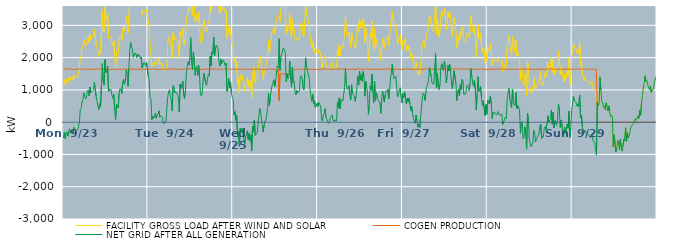
| Category | FACILITY GROSS LOAD AFTER WIND AND SOLAR | COGEN PRODUCTION | NET GRID AFTER ALL GENERATION |
|---|---|---|---|
|  Mon  9/23 | 1142 | 1635 | -493 |
|  Mon  9/23 | 1322 | 1630 | -308 |
|  Mon  9/23 | 1150 | 1656 | -506 |
|  Mon  9/23 | 1298 | 1635 | -337 |
|  Mon  9/23 | 1342 | 1638 | -296 |
|  Mon  9/23 | 1209 | 1644 | -435 |
|  Mon  9/23 | 1355 | 1656 | -301 |
|  Mon  9/23 | 1439 | 1647 | -208 |
|  Mon  9/23 | 1303 | 1643 | -340 |
|  Mon  9/23 | 1363 | 1641 | -278 |
|  Mon  9/23 | 1401 | 1644 | -243 |
|  Mon  9/23 | 1305 | 1645 | -340 |
|  Mon  9/23 | 1466 | 1624 | -158 |
|  Mon  9/23 | 1443 | 1645 | -202 |
|  Mon  9/23 | 1357 | 1649 | -292 |
|  Mon  9/23 | 1372 | 1648 | -276 |
|  Mon  9/23 | 1391 | 1645 | -254 |
|  Mon  9/23 | 1486 | 1633 | -147 |
|  Mon  9/23 | 1642 | 1653 | -11 |
|  Mon  9/23 | 2017 | 1637 | 380 |
|  Mon  9/23 | 2071 | 1639 | 432 |
|  Mon  9/23 | 2251 | 1643 | 608 |
|  Mon  9/23 | 2341 | 1645 | 696 |
|  Mon  9/23 | 2560 | 1650 | 910 |
|  Mon  9/23 | 2475 | 1656 | 819 |
|  Mon  9/23 | 2363 | 1646 | 717 |
|  Mon  9/23 | 2394 | 1633 | 761 |
|  Mon  9/23 | 2589 | 1630 | 959 |
|  Mon  9/23 | 2641 | 1646 | 995 |
|  Mon  9/23 | 2462 | 1648 | 814 |
|  Mon  9/23 | 2724 | 1638 | 1086 |
|  Mon  9/23 | 2541 | 1635 | 906 |
|  Mon  9/23 | 2583 | 1641 | 942 |
|  Mon  9/23 | 2618 | 1645 | 973 |
|  Mon  9/23 | 2645 | 1633 | 1012 |
|  Mon  9/23 | 2870 | 1634 | 1236 |
|  Mon  9/23 | 2862 | 1643 | 1219 |
|  Mon  9/23 | 2427 | 1629 | 798 |
|  Mon  9/23 | 2298 | 1653 | 645 |
|  Mon  9/23 | 2149 | 1647 | 502 |
|  Mon  9/23 | 2040 | 1643 | 397 |
|  Mon  9/23 | 2221 | 1643 | 578 |
|  Mon  9/23 | 2132 | 1653 | 479 |
|  Mon  9/23 | 2774 | 1649 | 1125 |
|  Mon  9/23 | 3462 | 1646 | 1816 |
|  Mon  9/23 | 2880 | 1625 | 1255 |
|  Mon  9/23 | 2790 | 1636 | 1154 |
|  Mon  9/23 | 3579 | 1641 | 1938 |
|  Mon  9/23 | 3178 | 1643 | 1535 |
|  Mon  9/23 | 3210 | 1627 | 1583 |
|  Mon  9/23 | 3377 | 1644 | 1733 |
|  Mon  9/23 | 2595 | 1648 | 947 |
|  Mon  9/23 | 2645 | 1634 | 1011 |
|  Mon  9/23 | 2635 | 1637 | 998 |
|  Mon  9/23 | 2640 | 1639 | 1001 |
|  Mon  9/23 | 2461 | 1646 | 815 |
|  Mon  9/23 | 2374 | 1633 | 741 |
|  Mon  9/23 | 2522 | 1661 | 861 |
|  Mon  9/23 | 2035 | 1647 | 388 |
|  Mon  9/23 | 1720 | 1638 | 82 |
|  Mon  9/23 | 2190 | 1632 | 558 |
|  Mon  9/23 | 2198 | 1634 | 564 |
|  Mon  9/23 | 2094 | 1646 | 448 |
|  Mon  9/23 | 2564 | 1647 | 917 |
|  Mon  9/23 | 2676 | 1641 | 1035 |
|  Mon  9/23 | 2637 | 1643 | 994 |
|  Mon  9/23 | 2527 | 1638 | 889 |
|  Mon  9/23 | 2866 | 1634 | 1232 |
|  Mon  9/23 | 2975 | 1646 | 1329 |
|  Mon  9/23 | 2819 | 1641 | 1178 |
|  Mon  9/23 | 2895 | 1643 | 1252 |
|  Mon  9/23 | 3273 | 1652 | 1621 |
|  Mon  9/23 | 3163 | 1639 | 1524 |
|  Mon  9/23 | 2748 | 1636 | 1112 |
|  Mon  9/23 | 3281 | 1639 | 1642 |
|  Mon  9/23 | 3867 | 1647 | 2220 |
|  Mon  9/23 | 4110 | 1647 | 2463 |
|  Mon  9/23 | 3961 | 1630 | 2331 |
|  Mon  9/23 | 3904 | 1643 | 2261 |
|  Mon  9/23 | 3646 | 1637 | 2009 |
|  Mon  9/23 | 3714 | 1638 | 2076 |
|  Mon  9/23 | 3788 | 1643 | 2145 |
|  Mon  9/23 | 3753 | 1643 | 2110 |
|  Mon  9/23 | 3640 | 1635 | 2005 |
|  Mon  9/23 | 3760 | 1645 | 2115 |
|  Mon  9/23 | 3684 | 1640 | 2044 |
|  Mon  9/23 | 3724 | 1643 | 2081 |
|  Mon  9/23 | 3597 | 1639 | 1958 |
|  Mon  9/23 | 3654 | 1631 | 2023 |
|  Mon  9/23 | 3324 | 1645 | 1679 |
|  Mon  9/23 | 3396 | 1641 | 1755 |
|  Mon  9/23 | 3487 | 1643 | 1844 |
|  Mon  9/23 | 3498 | 1639 | 1859 |
|  Mon  9/23 | 3399 | 1639 | 1760 |
|  Mon  9/23 | 3491 | 1640 | 1851 |
|  Mon  9/23 | 3475 | 1647 | 1828 |
|  Tue  9/24 | 3061 | 1635 | 1426 |
|  Tue  9/24 | 2957 | 1650 | 1307 |
|  Tue  9/24 | 2404 | 1637 | 767 |
|  Tue  9/24 | 2375 | 1640 | 735 |
|  Tue  9/24 | 1716 | 1639 | 77 |
|  Tue  9/24 | 1828 | 1635 | 193 |
|  Tue  9/24 | 1773 | 1658 | 115 |
|  Tue  9/24 | 1841 | 1650 | 191 |
|  Tue  9/24 | 1920 | 1642 | 278 |
|  Tue  9/24 | 1774 | 1653 | 121 |
|  Tue  9/24 | 1787 | 1636 | 151 |
|  Tue  9/24 | 1899 | 1637 | 262 |
|  Tue  9/24 | 1986 | 1631 | 355 |
|  Tue  9/24 | 1782 | 1630 | 152 |
|  Tue  9/24 | 1849 | 1640 | 209 |
|  Tue  9/24 | 1877 | 1648 | 229 |
|  Tue  9/24 | 1793 | 1636 | 157 |
|  Tue  9/24 | 1606 | 1644 | -38 |
|  Tue  9/24 | 1594 | 1644 | -50 |
|  Tue  9/24 | 1621 | 1641 | -20 |
|  Tue  9/24 | 1688 | 1643 | 45 |
|  Tue  9/24 | 1657 | 1634 | 23 |
|  Tue  9/24 | 2448 | 1646 | 802 |
|  Tue  9/24 | 2585 | 1644 | 941 |
|  Tue  9/24 | 2648 | 1646 | 1002 |
|  Tue  9/24 | 2428 | 1647 | 781 |
|  Tue  9/24 | 2348 | 1639 | 709 |
|  Tue  9/24 | 1996 | 1647 | 349 |
|  Tue  9/24 | 2782 | 1650 | 1132 |
|  Tue  9/24 | 2739 | 1640 | 1099 |
|  Tue  9/24 | 2550 | 1644 | 906 |
|  Tue  9/24 | 2598 | 1640 | 958 |
|  Tue  9/24 | 2564 | 1646 | 918 |
|  Tue  9/24 | 2575 | 1647 | 928 |
|  Tue  9/24 | 2391 | 1628 | 763 |
|  Tue  9/24 | 1961 | 1642 | 319 |
|  Tue  9/24 | 2801 | 1634 | 1167 |
|  Tue  9/24 | 2679 | 1639 | 1040 |
|  Tue  9/24 | 2720 | 1651 | 1069 |
|  Tue  9/24 | 2916 | 1647 | 1269 |
|  Tue  9/24 | 2481 | 1635 | 846 |
|  Tue  9/24 | 2391 | 1658 | 733 |
|  Tue  9/24 | 2612 | 1648 | 964 |
|  Tue  9/24 | 3159 | 1639 | 1520 |
|  Tue  9/24 | 3326 | 1641 | 1685 |
|  Tue  9/24 | 3510 | 1642 | 1868 |
|  Tue  9/24 | 3425 | 1650 | 1775 |
|  Tue  9/24 | 3632 | 1639 | 1993 |
|  Tue  9/24 | 4264 | 1647 | 2617 |
|  Tue  9/24 | 3466 | 1649 | 1817 |
|  Tue  9/24 | 3284 | 1657 | 1627 |
|  Tue  9/24 | 3817 | 1641 | 2176 |
|  Tue  9/24 | 3558 | 1652 | 1906 |
|  Tue  9/24 | 3096 | 1642 | 1454 |
|  Tue  9/24 | 3353 | 1655 | 1698 |
|  Tue  9/24 | 3382 | 1647 | 1735 |
|  Tue  9/24 | 3086 | 1640 | 1446 |
|  Tue  9/24 | 3415 | 1656 | 1759 |
|  Tue  9/24 | 3072 | 1644 | 1428 |
|  Tue  9/24 | 2503 | 1648 | 855 |
|  Tue  9/24 | 2444 | 1630 | 814 |
|  Tue  9/24 | 2530 | 1639 | 891 |
|  Tue  9/24 | 2951 | 1642 | 1309 |
|  Tue  9/24 | 3150 | 1641 | 1509 |
|  Tue  9/24 | 3171 | 1642 | 1529 |
|  Tue  9/24 | 2840 | 1649 | 1191 |
|  Tue  9/24 | 2798 | 1653 | 1145 |
|  Tue  9/24 | 2977 | 1644 | 1333 |
|  Tue  9/24 | 3120 | 1628 | 1492 |
|  Tue  9/24 | 3068 | 1630 | 1438 |
|  Tue  9/24 | 3686 | 1644 | 2042 |
|  Tue  9/24 | 3403 | 1656 | 1747 |
|  Tue  9/24 | 3820 | 1644 | 2176 |
|  Tue  9/24 | 3748 | 1643 | 2105 |
|  Tue  9/24 | 4276 | 1645 | 2631 |
|  Tue  9/24 | 3694 | 1634 | 2060 |
|  Tue  9/24 | 3939 | 1648 | 2291 |
|  Tue  9/24 | 4036 | 1644 | 2392 |
|  Tue  9/24 | 4031 | 1648 | 2383 |
|  Tue  9/24 | 3888 | 1640 | 2248 |
|  Tue  9/24 | 3484 | 1643 | 1841 |
|  Tue  9/24 | 3368 | 1631 | 1737 |
|  Tue  9/24 | 3605 | 1645 | 1960 |
|  Tue  9/24 | 3458 | 1644 | 1814 |
|  Tue  9/24 | 3516 | 1635 | 1881 |
|  Tue  9/24 | 3582 | 1653 | 1929 |
|  Tue  9/24 | 3593 | 1646 | 1947 |
|  Tue  9/24 | 3415 | 1656 | 1759 |
|  Tue  9/24 | 3476 | 1645 | 1831 |
|  Tue  9/24 | 2598 | 1644 | 954 |
|  Tue  9/24 | 2726 | 1644 | 1082 |
|  Tue  9/24 | 3005 | 1652 | 1353 |
|  Tue  9/24 | 2703 | 1639 | 1064 |
|  Tue  9/24 | 2887 | 1638 | 1249 |
|  Tue  9/24 | 2557 | 1645 | 912 |
|  Tue  9/24 | 2400 | 1636 | 764 |
|  Wed  9/25 | 2342 | 1637 | 705 |
|  Wed  9/25 | 1876 | 1647 | 229 |
|  Wed  9/25 | 1970 | 1641 | 329 |
|  Wed  9/25 | 1701 | 1641 | 60 |
|  Wed  9/25 | 1868 | 1646 | 222 |
|  Wed  9/25 | 1180 | 1638 | -458 |
|  Wed  9/25 | 1368 | 1644 | -276 |
|  Wed  9/25 | 900 | 1647 | -747 |
|  Wed  9/25 | 1451 | 1645 | -194 |
|  Wed  9/25 | 1352 | 1632 | -280 |
|  Wed  9/25 | 1455 | 1646 | -191 |
|  Wed  9/25 | 1298 | 1640 | -342 |
|  Wed  9/25 | 1302 | 1646 | -344 |
|  Wed  9/25 | 945 | 1632 | -687 |
|  Wed  9/25 | 1185 | 1634 | -449 |
|  Wed  9/25 | 1270 | 1647 | -377 |
|  Wed  9/25 | 1379 | 1649 | -270 |
|  Wed  9/25 | 1097 | 1635 | -538 |
|  Wed  9/25 | 1299 | 1633 | -334 |
|  Wed  9/25 | 1070 | 1641 | -571 |
|  Wed  9/25 | 1249 | 1643 | -394 |
|  Wed  9/25 | 769 | 1648 | -879 |
|  Wed  9/25 | 1528 | 1658 | -130 |
|  Wed  9/25 | 1358 | 1648 | -290 |
|  Wed  9/25 | 1697 | 1631 | 66 |
|  Wed  9/25 | 1217 | 1630 | -413 |
|  Wed  9/25 | 1255 | 1646 | -391 |
|  Wed  9/25 | 1290 | 1641 | -351 |
|  Wed  9/25 | 1532 | 1646 | -114 |
|  Wed  9/25 | 1814 | 1639 | 175 |
|  Wed  9/25 | 2058 | 1639 | 419 |
|  Wed  9/25 | 1944 | 1638 | 306 |
|  Wed  9/25 | 1748 | 1639 | 109 |
|  Wed  9/25 | 1774 | 1656 | 118 |
|  Wed  9/25 | 1325 | 1630 | -305 |
|  Wed  9/25 | 1553 | 1647 | -94 |
|  Wed  9/25 | 1664 | 1631 | 33 |
|  Wed  9/25 | 1712 | 1642 | 70 |
|  Wed  9/25 | 1861 | 1636 | 225 |
|  Wed  9/25 | 2101 | 1647 | 454 |
|  Wed  9/25 | 2544 | 1649 | 895 |
|  Wed  9/25 | 2157 | 1638 | 519 |
|  Wed  9/25 | 2425 | 1644 | 781 |
|  Wed  9/25 | 2617 | 1646 | 971 |
|  Wed  9/25 | 2772 | 1635 | 1137 |
|  Wed  9/25 | 2846 | 1645 | 1201 |
|  Wed  9/25 | 2951 | 1635 | 1316 |
|  Wed  9/25 | 2731 | 1640 | 1091 |
|  Wed  9/25 | 2907 | 1638 | 1269 |
|  Wed  9/25 | 3199 | 1647 | 1552 |
|  Wed  9/25 | 3274 | 1546 | 1728 |
|  Wed  9/25 | 3324 | 1644 | 1680 |
|  Wed  9/25 | 3258 | 670 | 2588 |
|  Wed  9/25 | 3101 | 1494 | 1607 |
|  Wed  9/25 | 3502 | 1492 | 2010 |
|  Wed  9/25 | 3606 | 1501 | 2105 |
|  Wed  9/25 | 3729 | 1492 | 2237 |
|  Wed  9/25 | 3791 | 1494 | 2297 |
|  Wed  9/25 | 3740 | 1492 | 2248 |
|  Wed  9/25 | 3621 | 1492 | 2129 |
|  Wed  9/25 | 2750 | 1489 | 1261 |
|  Wed  9/25 | 2994 | 1490 | 1504 |
|  Wed  9/25 | 2840 | 1487 | 1353 |
|  Wed  9/25 | 2912 | 1494 | 1418 |
|  Wed  9/25 | 3391 | 1501 | 1890 |
|  Wed  9/25 | 2850 | 1490 | 1360 |
|  Wed  9/25 | 2576 | 1492 | 1084 |
|  Wed  9/25 | 3205 | 1494 | 1711 |
|  Wed  9/25 | 2853 | 1631 | 1222 |
|  Wed  9/25 | 2907 | 1642 | 1265 |
|  Wed  9/25 | 2580 | 1637 | 943 |
|  Wed  9/25 | 2502 | 1653 | 849 |
|  Wed  9/25 | 2616 | 1635 | 981 |
|  Wed  9/25 | 2551 | 1642 | 909 |
|  Wed  9/25 | 2568 | 1646 | 922 |
|  Wed  9/25 | 2614 | 1638 | 976 |
|  Wed  9/25 | 3044 | 1642 | 1402 |
|  Wed  9/25 | 3090 | 1649 | 1441 |
|  Wed  9/25 | 3036 | 1648 | 1388 |
|  Wed  9/25 | 2694 | 1642 | 1052 |
|  Wed  9/25 | 2639 | 1642 | 997 |
|  Wed  9/25 | 3137 | 1643 | 1494 |
|  Wed  9/25 | 3636 | 1638 | 1998 |
|  Wed  9/25 | 3351 | 1636 | 1715 |
|  Wed  9/25 | 3253 | 1647 | 1606 |
|  Wed  9/25 | 3224 | 1636 | 1588 |
|  Wed  9/25 | 3008 | 1652 | 1356 |
|  Wed  9/25 | 2666 | 1642 | 1024 |
|  Wed  9/25 | 2445 | 1629 | 816 |
|  Wed  9/25 | 2293 | 1644 | 649 |
|  Wed  9/25 | 2498 | 1637 | 861 |
|  Wed  9/25 | 2204 | 1629 | 575 |
|  Wed  9/25 | 2291 | 1631 | 660 |
|  Wed  9/25 | 2107 | 1650 | 457 |
|  Wed  9/25 | 2160 | 1635 | 525 |
|  Wed  9/25 | 2241 | 1647 | 594 |
|  Thu  9/26 | 2132 | 1643 | 489 |
|  Thu  9/26 | 2248 | 1641 | 607 |
|  Thu  9/26 | 2186 | 1635 | 551 |
|  Thu  9/26 | 2129 | 1643 | 486 |
|  Thu  9/26 | 1737 | 1643 | 94 |
|  Thu  9/26 | 1667 | 1633 | 34 |
|  Thu  9/26 | 1887 | 1658 | 229 |
|  Thu  9/26 | 1912 | 1645 | 267 |
|  Thu  9/26 | 2067 | 1650 | 417 |
|  Thu  9/26 | 1795 | 1644 | 151 |
|  Thu  9/26 | 1728 | 1645 | 83 |
|  Thu  9/26 | 1660 | 1645 | 15 |
|  Thu  9/26 | 1598 | 1640 | -42 |
|  Thu  9/26 | 1630 | 1635 | -5 |
|  Thu  9/26 | 1782 | 1641 | 141 |
|  Thu  9/26 | 1823 | 1646 | 177 |
|  Thu  9/26 | 1859 | 1636 | 223 |
|  Thu  9/26 | 1702 | 1636 | 66 |
|  Thu  9/26 | 1665 | 1650 | 15 |
|  Thu  9/26 | 1705 | 1634 | 71 |
|  Thu  9/26 | 1711 | 1643 | 68 |
|  Thu  9/26 | 1677 | 1642 | 35 |
|  Thu  9/26 | 2257 | 1644 | 613 |
|  Thu  9/26 | 2073 | 1635 | 438 |
|  Thu  9/26 | 2408 | 1651 | 757 |
|  Thu  9/26 | 2056 | 1646 | 410 |
|  Thu  9/26 | 2346 | 1646 | 700 |
|  Thu  9/26 | 2360 | 1637 | 723 |
|  Thu  9/26 | 2294 | 1640 | 654 |
|  Thu  9/26 | 2501 | 1653 | 848 |
|  Thu  9/26 | 2718 | 1651 | 1067 |
|  Thu  9/26 | 3304 | 1639 | 1665 |
|  Thu  9/26 | 2839 | 1640 | 1199 |
|  Thu  9/26 | 2655 | 1637 | 1018 |
|  Thu  9/26 | 2685 | 1634 | 1051 |
|  Thu  9/26 | 2778 | 1644 | 1134 |
|  Thu  9/26 | 2471 | 1636 | 835 |
|  Thu  9/26 | 2317 | 1634 | 683 |
|  Thu  9/26 | 2797 | 1638 | 1159 |
|  Thu  9/26 | 2545 | 1650 | 895 |
|  Thu  9/26 | 2495 | 1651 | 844 |
|  Thu  9/26 | 2463 | 1652 | 811 |
|  Thu  9/26 | 2285 | 1639 | 646 |
|  Thu  9/26 | 2421 | 1642 | 779 |
|  Thu  9/26 | 2705 | 1635 | 1070 |
|  Thu  9/26 | 3063 | 1640 | 1423 |
|  Thu  9/26 | 2815 | 1654 | 1161 |
|  Thu  9/26 | 3203 | 1628 | 1575 |
|  Thu  9/26 | 2943 | 1641 | 1302 |
|  Thu  9/26 | 3104 | 1634 | 1470 |
|  Thu  9/26 | 2923 | 1652 | 1271 |
|  Thu  9/26 | 3207 | 1640 | 1567 |
|  Thu  9/26 | 3076 | 1644 | 1432 |
|  Thu  9/26 | 2456 | 1652 | 804 |
|  Thu  9/26 | 2911 | 1646 | 1265 |
|  Thu  9/26 | 2725 | 1645 | 1080 |
|  Thu  9/26 | 2576 | 1640 | 936 |
|  Thu  9/26 | 1877 | 1636 | 241 |
|  Thu  9/26 | 2196 | 1648 | 548 |
|  Thu  9/26 | 2753 | 1638 | 1115 |
|  Thu  9/26 | 2640 | 1647 | 993 |
|  Thu  9/26 | 3127 | 1637 | 1490 |
|  Thu  9/26 | 2583 | 1639 | 944 |
|  Thu  9/26 | 2232 | 1640 | 592 |
|  Thu  9/26 | 2909 | 1635 | 1274 |
|  Thu  9/26 | 2318 | 1655 | 663 |
|  Thu  9/26 | 2557 | 1646 | 911 |
|  Thu  9/26 | 2403 | 1630 | 773 |
|  Thu  9/26 | 2316 | 1637 | 679 |
|  Thu  9/26 | 2328 | 1638 | 690 |
|  Thu  9/26 | 2242 | 1643 | 599 |
|  Thu  9/26 | 1917 | 1646 | 271 |
|  Thu  9/26 | 2363 | 1635 | 728 |
|  Thu  9/26 | 2599 | 1638 | 961 |
|  Thu  9/26 | 2599 | 1635 | 964 |
|  Thu  9/26 | 2261 | 1639 | 622 |
|  Thu  9/26 | 2502 | 1652 | 850 |
|  Thu  9/26 | 2618 | 1647 | 971 |
|  Thu  9/26 | 2580 | 1641 | 939 |
|  Thu  9/26 | 2674 | 1645 | 1029 |
|  Thu  9/26 | 2365 | 1647 | 718 |
|  Thu  9/26 | 2634 | 1652 | 982 |
|  Thu  9/26 | 2984 | 1636 | 1348 |
|  Thu  9/26 | 3184 | 1652 | 1532 |
|  Thu  9/26 | 3447 | 1644 | 1803 |
|  Thu  9/26 | 3126 | 1642 | 1484 |
|  Thu  9/26 | 2999 | 1651 | 1348 |
|  Thu  9/26 | 3001 | 1639 | 1362 |
|  Thu  9/26 | 3055 | 1633 | 1422 |
|  Thu  9/26 | 2711 | 1629 | 1082 |
|  Thu  9/26 | 2428 | 1638 | 790 |
|  Thu  9/26 | 2518 | 1641 | 877 |
|  Thu  9/26 | 2511 | 1642 | 869 |
|  Thu  9/26 | 2714 | 1647 | 1067 |
|  Thu  9/26 | 2415 | 1635 | 780 |
|  Thu  9/26 | 2236 | 1640 | 596 |
|  Fri  9/27 | 2524 | 1644 | 880 |
|  Fri  9/27 | 2396 | 1636 | 760 |
|  Fri  9/27 | 2579 | 1635 | 944 |
|  Fri  9/27 | 2592 | 1647 | 945 |
|  Fri  9/27 | 2209 | 1646 | 563 |
|  Fri  9/27 | 2371 | 1632 | 739 |
|  Fri  9/27 | 2271 | 1644 | 627 |
|  Fri  9/27 | 2379 | 1634 | 745 |
|  Fri  9/27 | 2203 | 1644 | 559 |
|  Fri  9/27 | 2000 | 1641 | 359 |
|  Fri  9/27 | 2129 | 1638 | 491 |
|  Fri  9/27 | 1904 | 1637 | 267 |
|  Fri  9/27 | 1749 | 1642 | 107 |
|  Fri  9/27 | 1734 | 1642 | 92 |
|  Fri  9/27 | 1605 | 1638 | -33 |
|  Fri  9/27 | 1858 | 1638 | 220 |
|  Fri  9/27 | 1695 | 1650 | 45 |
|  Fri  9/27 | 1487 | 1639 | -152 |
|  Fri  9/27 | 1574 | 1636 | -62 |
|  Fri  9/27 | 1471 | 1647 | -176 |
|  Fri  9/27 | 1772 | 1641 | 131 |
|  Fri  9/27 | 1785 | 1644 | 141 |
|  Fri  9/27 | 2380 | 1636 | 744 |
|  Fri  9/27 | 2552 | 1649 | 903 |
|  Fri  9/27 | 2498 | 1633 | 865 |
|  Fri  9/27 | 2316 | 1640 | 676 |
|  Fri  9/27 | 2596 | 1655 | 941 |
|  Fri  9/27 | 2746 | 1644 | 1102 |
|  Fri  9/27 | 2752 | 1641 | 1111 |
|  Fri  9/27 | 2930 | 1644 | 1286 |
|  Fri  9/27 | 3328 | 1635 | 1693 |
|  Fri  9/27 | 3308 | 1645 | 1663 |
|  Fri  9/27 | 3070 | 1648 | 1422 |
|  Fri  9/27 | 2855 | 1638 | 1217 |
|  Fri  9/27 | 2876 | 1643 | 1233 |
|  Fri  9/27 | 2806 | 1635 | 1171 |
|  Fri  9/27 | 2822 | 1650 | 1172 |
|  Fri  9/27 | 3770 | 1636 | 2134 |
|  Fri  9/27 | 2700 | 1644 | 1056 |
|  Fri  9/27 | 3170 | 1649 | 1521 |
|  Fri  9/27 | 2730 | 1635 | 1095 |
|  Fri  9/27 | 2652 | 1641 | 1011 |
|  Fri  9/27 | 2819 | 1638 | 1181 |
|  Fri  9/27 | 3341 | 1638 | 1703 |
|  Fri  9/27 | 3456 | 1645 | 1811 |
|  Fri  9/27 | 3281 | 1635 | 1646 |
|  Fri  9/27 | 3234 | 1631 | 1603 |
|  Fri  9/27 | 3529 | 1632 | 1897 |
|  Fri  9/27 | 3351 | 1661 | 1690 |
|  Fri  9/27 | 2855 | 1633 | 1222 |
|  Fri  9/27 | 3035 | 1643 | 1392 |
|  Fri  9/27 | 3405 | 1645 | 1760 |
|  Fri  9/27 | 3239 | 1647 | 1592 |
|  Fri  9/27 | 3416 | 1626 | 1790 |
|  Fri  9/27 | 3206 | 1652 | 1554 |
|  Fri  9/27 | 2855 | 1642 | 1213 |
|  Fri  9/27 | 2668 | 1640 | 1028 |
|  Fri  9/27 | 2668 | 1646 | 1022 |
|  Fri  9/27 | 3236 | 1648 | 1588 |
|  Fri  9/27 | 3249 | 1638 | 1611 |
|  Fri  9/27 | 2848 | 1642 | 1206 |
|  Fri  9/27 | 2313 | 1647 | 666 |
|  Fri  9/27 | 2583 | 1639 | 944 |
|  Fri  9/27 | 2679 | 1653 | 1026 |
|  Fri  9/27 | 2465 | 1649 | 816 |
|  Fri  9/27 | 2811 | 1649 | 1162 |
|  Fri  9/27 | 2658 | 1648 | 1010 |
|  Fri  9/27 | 2965 | 1640 | 1325 |
|  Fri  9/27 | 2933 | 1645 | 1288 |
|  Fri  9/27 | 2495 | 1643 | 852 |
|  Fri  9/27 | 2500 | 1647 | 853 |
|  Fri  9/27 | 2529 | 1650 | 879 |
|  Fri  9/27 | 2696 | 1647 | 1049 |
|  Fri  9/27 | 2794 | 1638 | 1156 |
|  Fri  9/27 | 2774 | 1647 | 1127 |
|  Fri  9/27 | 2634 | 1649 | 985 |
|  Fri  9/27 | 2854 | 1644 | 1210 |
|  Fri  9/27 | 3307 | 1646 | 1661 |
|  Fri  9/27 | 3048 | 1633 | 1415 |
|  Fri  9/27 | 2845 | 1644 | 1201 |
|  Fri  9/27 | 2765 | 1648 | 1117 |
|  Fri  9/27 | 2952 | 1649 | 1303 |
|  Fri  9/27 | 2638 | 1639 | 999 |
|  Fri  9/27 | 2024 | 1641 | 383 |
|  Fri  9/27 | 2493 | 1631 | 862 |
|  Fri  9/27 | 3040 | 1630 | 1410 |
|  Fri  9/27 | 2589 | 1637 | 952 |
|  Fri  9/27 | 2649 | 1644 | 1005 |
|  Fri  9/27 | 2756 | 1652 | 1104 |
|  Fri  9/27 | 2366 | 1641 | 725 |
|  Fri  9/27 | 2161 | 1650 | 511 |
|  Fri  9/27 | 2307 | 1643 | 664 |
|  Fri  9/27 | 2263 | 1628 | 635 |
|  Fri  9/27 | 1843 | 1641 | 202 |
|  Fri  9/27 | 2187 | 1638 | 549 |
|  Fri  9/27 | 1886 | 1640 | 246 |
|  Sat  9/28 | 2314 | 1629 | 685 |
|  Sat  9/28 | 2343 | 1649 | 694 |
|  Sat  9/28 | 2198 | 1639 | 559 |
|  Sat  9/28 | 2447 | 1640 | 807 |
|  Sat  9/28 | 2242 | 1640 | 602 |
|  Sat  9/28 | 1750 | 1638 | 112 |
|  Sat  9/28 | 1940 | 1638 | 302 |
|  Sat  9/28 | 1925 | 1642 | 283 |
|  Sat  9/28 | 1939 | 1640 | 299 |
|  Sat  9/28 | 1962 | 1640 | 322 |
|  Sat  9/28 | 1861 | 1641 | 220 |
|  Sat  9/28 | 1922 | 1642 | 280 |
|  Sat  9/28 | 1968 | 1638 | 330 |
|  Sat  9/28 | 1873 | 1643 | 230 |
|  Sat  9/28 | 1878 | 1656 | 222 |
|  Sat  9/28 | 1850 | 1640 | 210 |
|  Sat  9/28 | 1909 | 1649 | 260 |
|  Sat  9/28 | 1577 | 1647 | -70 |
|  Sat  9/28 | 1635 | 1633 | 2 |
|  Sat  9/28 | 1672 | 1644 | 28 |
|  Sat  9/28 | 1794 | 1642 | 152 |
|  Sat  9/28 | 1729 | 1625 | 104 |
|  Sat  9/28 | 2339 | 1641 | 698 |
|  Sat  9/28 | 2551 | 1644 | 907 |
|  Sat  9/28 | 2690 | 1645 | 1045 |
|  Sat  9/28 | 2357 | 1646 | 711 |
|  Sat  9/28 | 2193 | 1640 | 553 |
|  Sat  9/28 | 2107 | 1655 | 452 |
|  Sat  9/28 | 2660 | 1645 | 1015 |
|  Sat  9/28 | 2343 | 1643 | 700 |
|  Sat  9/28 | 2178 | 1632 | 546 |
|  Sat  9/28 | 2156 | 1655 | 501 |
|  Sat  9/28 | 2555 | 1639 | 916 |
|  Sat  9/28 | 2053 | 1636 | 417 |
|  Sat  9/28 | 2164 | 1647 | 517 |
|  Sat  9/28 | 2170 | 1641 | 529 |
|  Sat  9/28 | 2027 | 1635 | 392 |
|  Sat  9/28 | 1286 | 1629 | -343 |
|  Sat  9/28 | 1622 | 1638 | -16 |
|  Sat  9/28 | 1653 | 1638 | 15 |
|  Sat  9/28 | 1133 | 1646 | -513 |
|  Sat  9/28 | 1175 | 1647 | -472 |
|  Sat  9/28 | 1508 | 1649 | -141 |
|  Sat  9/28 | 1274 | 1648 | -374 |
|  Sat  9/28 | 810 | 1647 | -837 |
|  Sat  9/28 | 1913 | 1637 | 276 |
|  Sat  9/28 | 1727 | 1647 | 80 |
|  Sat  9/28 | 1118 | 1646 | -528 |
|  Sat  9/28 | 1076 | 1631 | -555 |
|  Sat  9/28 | 880 | 1644 | -764 |
|  Sat  9/28 | 857 | 1647 | -790 |
|  Sat  9/28 | 1005 | 1662 | -657 |
|  Sat  9/28 | 1390 | 1636 | -246 |
|  Sat  9/28 | 1369 | 1655 | -286 |
|  Sat  9/28 | 1018 | 1624 | -606 |
|  Sat  9/28 | 1109 | 1644 | -535 |
|  Sat  9/28 | 1165 | 1634 | -469 |
|  Sat  9/28 | 1207 | 1620 | -413 |
|  Sat  9/28 | 1277 | 1646 | -369 |
|  Sat  9/28 | 1513 | 1629 | -116 |
|  Sat  9/28 | 1585 | 1640 | -55 |
|  Sat  9/28 | 1138 | 1643 | -505 |
|  Sat  9/28 | 1227 | 1647 | -420 |
|  Sat  9/28 | 1180 | 1635 | -455 |
|  Sat  9/28 | 1448 | 1636 | -188 |
|  Sat  9/28 | 1514 | 1651 | -137 |
|  Sat  9/28 | 1413 | 1647 | -234 |
|  Sat  9/28 | 1612 | 1645 | -33 |
|  Sat  9/28 | 1847 | 1645 | 202 |
|  Sat  9/28 | 1611 | 1623 | -12 |
|  Sat  9/28 | 1630 | 1649 | -19 |
|  Sat  9/28 | 1752 | 1643 | 109 |
|  Sat  9/28 | 2030 | 1651 | 379 |
|  Sat  9/28 | 1578 | 1639 | -61 |
|  Sat  9/28 | 1950 | 1647 | 303 |
|  Sat  9/28 | 1469 | 1643 | -174 |
|  Sat  9/28 | 1687 | 1639 | 48 |
|  Sat  9/28 | 1606 | 1637 | -31 |
|  Sat  9/28 | 1541 | 1636 | -95 |
|  Sat  9/28 | 1747 | 1649 | 98 |
|  Sat  9/28 | 2210 | 1647 | 563 |
|  Sat  9/28 | 2033 | 1634 | 399 |
|  Sat  9/28 | 1481 | 1645 | -164 |
|  Sat  9/28 | 1709 | 1647 | 62 |
|  Sat  9/28 | 1722 | 1639 | 83 |
|  Sat  9/28 | 1387 | 1655 | -268 |
|  Sat  9/28 | 1241 | 1635 | -394 |
|  Sat  9/28 | 1474 | 1634 | -160 |
|  Sat  9/28 | 1304 | 1640 | -336 |
|  Sat  9/28 | 1325 | 1641 | -316 |
|  Sat  9/28 | 1586 | 1649 | -63 |
|  Sat  9/28 | 1437 | 1625 | -188 |
|  Sat  9/28 | 1984 | 1641 | 343 |
|  Sat  9/28 | 1169 | 1644 | -475 |
|  Sat  9/28 | 1469 | 1646 | -177 |
|  Sat  9/28 | 2043 | 1640 | 403 |
|  Sun  9/29 | 2196 | 1636 | 560 |
|  Sun  9/29 | 2439 | 1640 | 799 |
|  Sun  9/29 | 2317 | 1646 | 671 |
|  Sun  9/29 | 2318 | 1634 | 684 |
|  Sun  9/29 | 2251 | 1645 | 606 |
|  Sun  9/29 | 2140 | 1644 | 496 |
|  Sun  9/29 | 2192 | 1638 | 554 |
|  Sun  9/29 | 2121 | 1637 | 484 |
|  Sun  9/29 | 2488 | 1647 | 841 |
|  Sun  9/29 | 1761 | 1633 | 128 |
|  Sun  9/29 | 1872 | 1650 | 222 |
|  Sun  9/29 | 1506 | 1632 | -126 |
|  Sun  9/29 | 1525 | 1643 | -118 |
|  Sun  9/29 | 1293 | 1635 | -342 |
|  Sun  9/29 | 1401 | 1647 | -246 |
|  Sun  9/29 | 1317 | 1642 | -325 |
|  Sun  9/29 | 1347 | 1644 | -297 |
|  Sun  9/29 | 1276 | 1638 | -362 |
|  Sun  9/29 | 1247 | 1627 | -380 |
|  Sun  9/29 | 1201 | 1637 | -436 |
|  Sun  9/29 | 1167 | 1652 | -485 |
|  Sun  9/29 | 1162 | 1659 | -497 |
|  Sun  9/29 | 1265 | 1648 | -383 |
|  Sun  9/29 | 1081 | 1643 | -562 |
|  Sun  9/29 | 1047 | 1634 | -587 |
|  Sun  9/29 | 997 | 1635 | -638 |
|  Sun  9/29 | 1036 | 1651 | -615 |
|  Sun  9/29 | 595 | 1614 | -1019 |
|  Sun  9/29 | 607 | 0 | 607 |
|  Sun  9/29 | 513 | 0 | 513 |
|  Sun  9/29 | 592 | 0 | 592 |
|  Sun  9/29 | 1406 | 0 | 1406 |
|  Sun  9/29 | 995 | 0 | 995 |
|  Sun  9/29 | 662 | 0 | 662 |
|  Sun  9/29 | 608 | 0 | 608 |
|  Sun  9/29 | 466 | 0 | 466 |
|  Sun  9/29 | 512 | 0 | 512 |
|  Sun  9/29 | 384 | 0 | 384 |
|  Sun  9/29 | 598 | 0 | 598 |
|  Sun  9/29 | 488 | 0 | 488 |
|  Sun  9/29 | 348 | 0 | 348 |
|  Sun  9/29 | 506 | 0 | 506 |
|  Sun  9/29 | 324 | 0 | 324 |
|  Sun  9/29 | 171 | 0 | 171 |
|  Sun  9/29 | 217 | 0 | 217 |
|  Sun  9/29 | 180 | 0 | 180 |
|  Sun  9/29 | -771 | 0 | -771 |
|  Sun  9/29 | -388 | 0 | -388 |
|  Sun  9/29 | -405 | 0 | -405 |
|  Sun  9/29 | -918 | 0 | -918 |
|  Sun  9/29 | -803 | 0 | -803 |
|  Sun  9/29 | -565 | 0 | -565 |
|  Sun  9/29 | -603 | 0 | -603 |
|  Sun  9/29 | -848 | 0 | -848 |
|  Sun  9/29 | -520 | 0 | -520 |
|  Sun  9/29 | -774 | 0 | -774 |
|  Sun  9/29 | -896 | 0 | -896 |
|  Sun  9/29 | -904 | 0 | -904 |
|  Sun  9/29 | -527 | 0 | -527 |
|  Sun  9/29 | -589 | 0 | -589 |
|  Sun  9/29 | -173 | 0 | -173 |
|  Sun  9/29 | -598 | 0 | -598 |
|  Sun  9/29 | -329 | 0 | -329 |
|  Sun  9/29 | -495 | 0 | -495 |
|  Sun  9/29 | -428 | 0 | -428 |
|  Sun  9/29 | -267 | 0 | -267 |
|  Sun  9/29 | -163 | 0 | -163 |
|  Sun  9/29 | -142 | 0 | -142 |
|  Sun  9/29 | -67 | 0 | -67 |
|  Sun  9/29 | -33 | 0 | -33 |
|  Sun  9/29 | 11 | 0 | 11 |
|  Sun  9/29 | 116 | 0 | 116 |
|  Sun  9/29 | 59 | 0 | 59 |
|  Sun  9/29 | 98 | 0 | 98 |
|  Sun  9/29 | 193 | 0 | 193 |
|  Sun  9/29 | 118 | 0 | 118 |
|  Sun  9/29 | 378 | 0 | 378 |
|  Sun  9/29 | 214 | 0 | 214 |
|  Sun  9/29 | 604 | 0 | 604 |
|  Sun  9/29 | 823 | 0 | 823 |
|  Sun  9/29 | 1035 | 0 | 1035 |
|  Sun  9/29 | 1215 | 0 | 1215 |
|  Sun  9/29 | 1440 | 0 | 1440 |
|  Sun  9/29 | 1265 | 0 | 1265 |
|  Sun  9/29 | 1297 | 0 | 1297 |
|  Sun  9/29 | 1180 | 0 | 1180 |
|  Sun  9/29 | 1045 | 0 | 1045 |
|  Sun  9/29 | 1012 | 0 | 1012 |
|  Sun  9/29 | 1117 | 0 | 1117 |
|  Sun  9/29 | 921 | 0 | 921 |
|  Sun  9/29 | 917 | 0 | 917 |
|  Sun  9/29 | 1020 | 0 | 1020 |
|  Sun  9/29 | 1134 | 0 | 1134 |
|  Sun  9/29 | 1291 | 0 | 1291 |
|  Sun  9/29 | 1362 | 0 | 1362 |
|  Sun  9/29 | 1454 | 0 | 1454 |